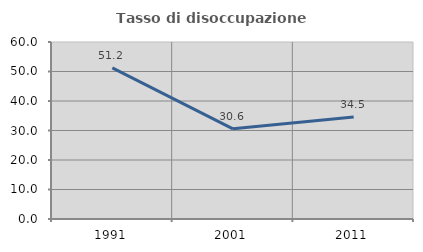
| Category | Tasso di disoccupazione giovanile  |
|---|---|
| 1991.0 | 51.2 |
| 2001.0 | 30.556 |
| 2011.0 | 34.545 |